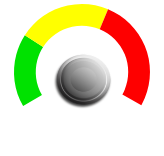
| Category | PIE |
|---|---|
| 0 | 3 |
| 1 | 0.3 |
| 2 | 19.2 |